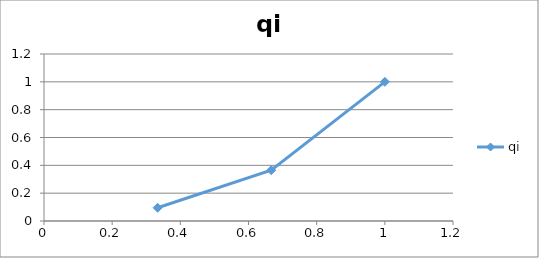
| Category | qi |
|---|---|
| 0.3333333333333333 | 0.095 |
| 0.6666666666666666 | 0.365 |
| 1.0 | 1 |